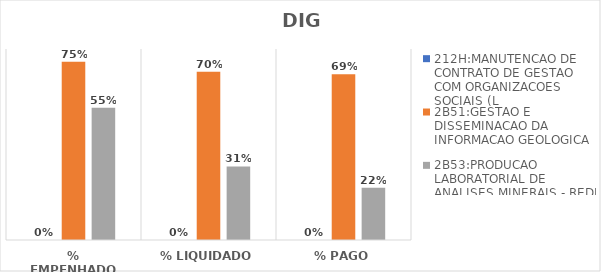
| Category | 212H:MANUTENCAO DE CONTRATO DE GESTAO COM ORGANIZACOES SOCIAIS (L | 2B51:GESTAO E DISSEMINACAO DA INFORMACAO GEOLOGICA | 2B53:PRODUCAO LABORATORIAL DE ANALISES MINERAIS - REDE LAMIN |
|---|---|---|---|
| % EMPENHADO | 0 | 0.746 | 0.553 |
| % LIQUIDADO | 0 | 0.704 | 0.308 |
| % PAGO | 0 | 0.694 | 0.219 |